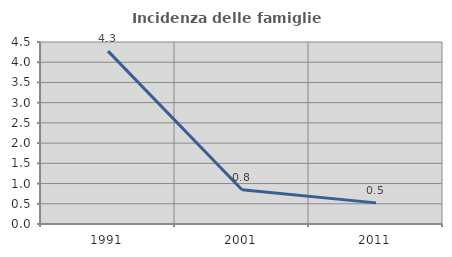
| Category | Incidenza delle famiglie numerose |
|---|---|
| 1991.0 | 4.274 |
| 2001.0 | 0.845 |
| 2011.0 | 0.522 |